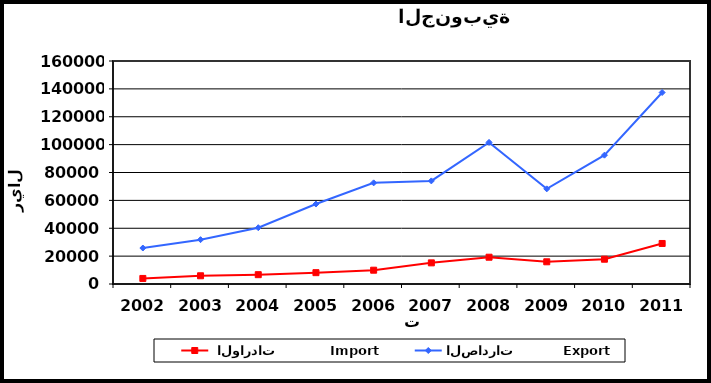
| Category |  الواردات           Import | الصادرات          Export |
|---|---|---|
| 2002.0 | 3989 | 25813 |
| 2003.0 | 5897 | 31816 |
| 2004.0 | 6688 | 40382 |
| 2005.0 | 8138 | 57368 |
| 2006.0 | 9900 | 72570 |
| 2007.0 | 15162 | 73972 |
| 2008.0 | 19218 | 101621 |
| 2009.0 | 15931 | 68263 |
| 2010.0 | 17789 | 92431 |
| 2011.0 | 29076 | 137392 |